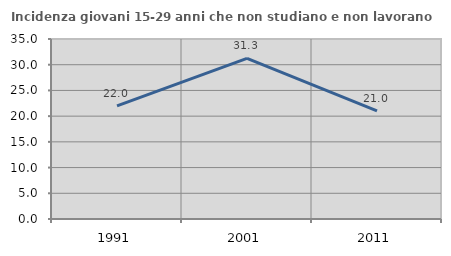
| Category | Incidenza giovani 15-29 anni che non studiano e non lavorano  |
|---|---|
| 1991.0 | 22.013 |
| 2001.0 | 31.25 |
| 2011.0 | 21.008 |